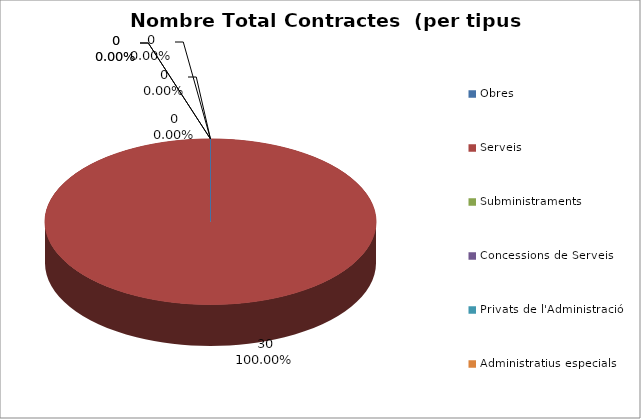
| Category | Nombre Total Contractes |
|---|---|
| Obres | 0 |
| Serveis | 30 |
| Subministraments | 0 |
| Concessions de Serveis | 0 |
| Privats de l'Administració | 0 |
| Administratius especials | 0 |